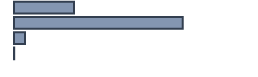
| Category | Percentatge |
|---|---|
| 0 | 25 |
| 1 | 70.303 |
| 2 | 4.621 |
| 3 | 0.076 |